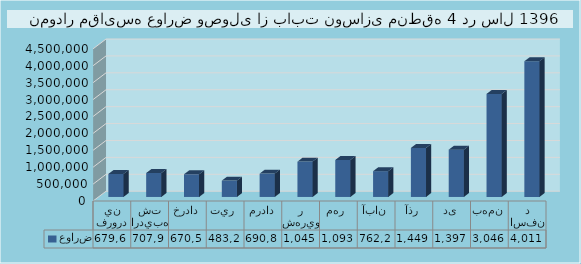
| Category | عوارض |
|---|---|
| فروردين | 679695 |
| ارديبهشت | 707936 |
| خرداد | 670520 |
| تير  | 483262 |
| مرداد | 690851 |
| شهريور | 1045343 |
| مهر  | 1093519 |
| آبان | 762206 |
| آذر | 1449270 |
| دی | 1397353 |
| بهمن | 3046425 |
| اسفند | 4011581 |